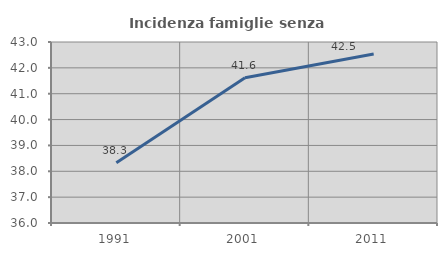
| Category | Incidenza famiglie senza nuclei |
|---|---|
| 1991.0 | 38.326 |
| 2001.0 | 41.62 |
| 2011.0 | 42.537 |